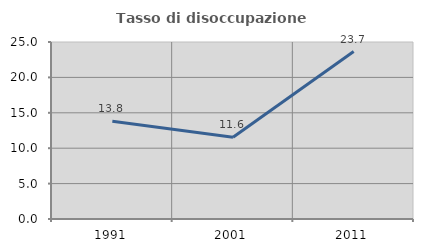
| Category | Tasso di disoccupazione giovanile  |
|---|---|
| 1991.0 | 13.793 |
| 2001.0 | 11.557 |
| 2011.0 | 23.656 |